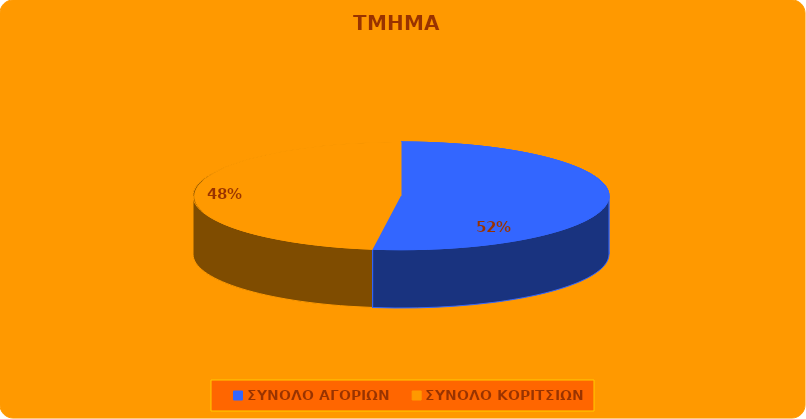
| Category | Series 0 |
|---|---|
| ΣΥΝΟΛΟ ΑΓΟΡΙΩΝ | 12 |
| ΣΥΝΟΛΟ ΚΟΡΙΤΣΙΩΝ | 11 |